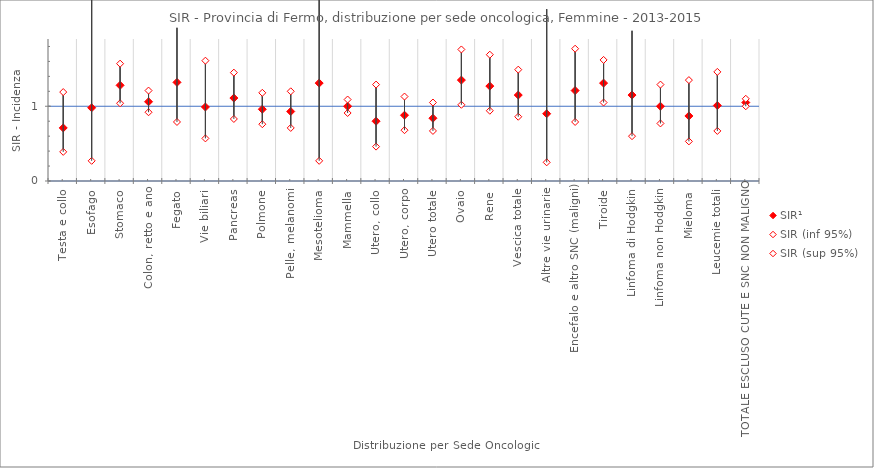
| Category | SIR¹ | SIR (inf 95%) | SIR (sup 95%) |
|---|---|---|---|
| Testa e collo | 0.71 | 0.39 | 1.19 |
| Esofago | 0.98 | 0.27 | 2.51 |
| Stomaco | 1.28 | 1.04 | 1.57 |
| Colon, retto e ano | 1.06 | 0.92 | 1.21 |
| Fegato | 1.32 | 0.79 | 2.05 |
| Vie biliari | 0.99 | 0.57 | 1.61 |
| Pancreas | 1.11 | 0.83 | 1.45 |
| Polmone | 0.96 | 0.76 | 1.18 |
| Pelle, melanomi | 0.93 | 0.71 | 1.2 |
| Mesotelioma | 1.31 | 0.27 | 3.84 |
| Mammella | 1 | 0.91 | 1.09 |
| Utero, collo | 0.8 | 0.46 | 1.29 |
| Utero, corpo | 0.88 | 0.68 | 1.13 |
| Utero totale | 0.84 | 0.67 | 1.05 |
| Ovaio | 1.35 | 1.02 | 1.76 |
| Rene | 1.27 | 0.94 | 1.69 |
| Vescica totale | 1.15 | 0.86 | 1.49 |
| Altre vie urinarie | 0.9 | 0.25 | 2.3 |
| Encefalo e altro SNC (maligni) | 1.21 | 0.79 | 1.77 |
| Tiroide | 1.31 | 1.05 | 1.62 |
| Linfoma di Hodgkin | 1.15 | 0.6 | 2.01 |
| Linfoma non Hodgkin | 1 | 0.77 | 1.29 |
| Mieloma | 0.87 | 0.53 | 1.35 |
| Leucemie totali | 1.01 | 0.67 | 1.46 |
| TOTALE ESCLUSO CUTE E SNC NON MALIGNO | 1.05 | 1 | 1.1 |